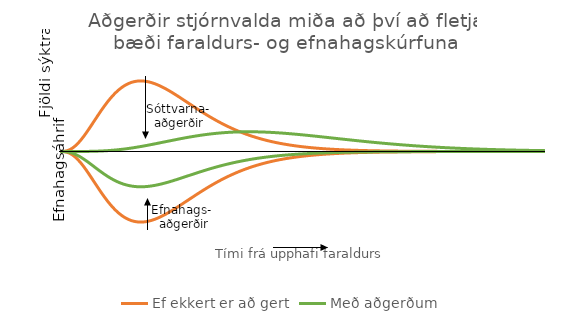
| Category | Ef ekkert er að gert | Með aðgerðum | Series 2 | Series 3 |
|---|---|---|---|---|
|  | 0 | 0 | 0 | 0 |
|  | 0 | 0 | 0 | 0 |
|  | 0 | 0 | 0 | 0 |
|  | 0 | 0 | 0 | 0 |
|  | 0 | 0 | 0 | 0 |
|  | 0.001 | 0 | -0.001 | 0 |
|  | 0.001 | 0 | -0.001 | 0 |
|  | 0.001 | 0 | -0.001 | -0.001 |
|  | 0.002 | 0 | -0.002 | -0.001 |
|  | 0.002 | 0 | -0.002 | -0.001 |
|  | 0.003 | 0 | -0.003 | -0.001 |
|  | 0.004 | 0 | -0.004 | -0.002 |
|  | 0.005 | 0 | -0.005 | -0.002 |
|  | 0.006 | 0 | -0.006 | -0.003 |
|  | 0.007 | 0 | -0.007 | -0.003 |
|  | 0.008 | 0 | -0.008 | -0.004 |
|  | 0.009 | 0 | -0.009 | -0.005 |
|  | 0.011 | 0 | -0.011 | -0.005 |
|  | 0.013 | 0 | -0.013 | -0.006 |
|  | 0.014 | 0 | -0.014 | -0.007 |
|  | 0.016 | 0 | -0.016 | -0.008 |
|  | 0.018 | 0 | -0.018 | -0.009 |
|  | 0.02 | 0 | -0.02 | -0.01 |
|  | 0.023 | 0 | -0.023 | -0.011 |
|  | 0.025 | 0 | -0.025 | -0.013 |
|  | 0.028 | 0 | -0.028 | -0.014 |
|  | 0.031 | 0 | -0.031 | -0.015 |
|  | 0.033 | 0 | -0.033 | -0.017 |
|  | 0.036 | 0 | -0.036 | -0.018 |
|  | 0.04 | 0 | -0.04 | -0.02 |
|  | 0.043 | 0 | -0.043 | -0.021 |
|  | 0.046 | 0 | -0.046 | -0.023 |
|  | 0.05 | 0 | -0.05 | -0.025 |
|  | 0.053 | 0 | -0.053 | -0.027 |
|  | 0.057 | 0 | -0.057 | -0.028 |
|  | 0.061 | 0 | -0.061 | -0.03 |
|  | 0.064 | 0 | -0.064 | -0.032 |
|  | 0.068 | 0 | -0.068 | -0.034 |
|  | 0.073 | 0 | -0.073 | -0.036 |
|  | 0.077 | 0 | -0.077 | -0.038 |
|  | 0.081 | 0 | -0.081 | -0.04 |
|  | 0.085 | 0 | -0.085 | -0.043 |
|  | 0.09 | 0 | -0.09 | -0.045 |
|  | 0.094 | 0 | -0.094 | -0.047 |
|  | 0.099 | 0 | -0.099 | -0.049 |
|  | 0.103 | 0 | -0.103 | -0.052 |
|  | 0.108 | 0 | -0.108 | -0.054 |
|  | 0.113 | 0 | -0.113 | -0.056 |
|  | 0.118 | 0 | -0.118 | -0.059 |
|  | 0.123 | 0.001 | -0.123 | -0.061 |
|  | 0.128 | 0.001 | -0.128 | -0.064 |
|  | 0.133 | 0.001 | -0.133 | -0.066 |
|  | 0.138 | 0.001 | -0.138 | -0.069 |
|  | 0.143 | 0.001 | -0.143 | -0.071 |
|  | 0.148 | 0.001 | -0.148 | -0.074 |
|  | 0.153 | 0.001 | -0.153 | -0.076 |
|  | 0.158 | 0.001 | -0.158 | -0.079 |
|  | 0.163 | 0.001 | -0.163 | -0.082 |
|  | 0.168 | 0.001 | -0.168 | -0.084 |
|  | 0.173 | 0.001 | -0.173 | -0.087 |
|  | 0.179 | 0.001 | -0.179 | -0.089 |
|  | 0.184 | 0.001 | -0.184 | -0.092 |
|  | 0.189 | 0.001 | -0.189 | -0.095 |
|  | 0.194 | 0.002 | -0.194 | -0.097 |
|  | 0.2 | 0.002 | -0.2 | -0.1 |
|  | 0.205 | 0.002 | -0.205 | -0.102 |
|  | 0.21 | 0.002 | -0.21 | -0.105 |
|  | 0.215 | 0.002 | -0.215 | -0.108 |
|  | 0.22 | 0.002 | -0.22 | -0.11 |
|  | 0.226 | 0.002 | -0.226 | -0.113 |
|  | 0.231 | 0.002 | -0.231 | -0.115 |
|  | 0.236 | 0.002 | -0.236 | -0.118 |
|  | 0.241 | 0.003 | -0.241 | -0.12 |
|  | 0.246 | 0.003 | -0.246 | -0.123 |
|  | 0.251 | 0.003 | -0.251 | -0.126 |
|  | 0.256 | 0.003 | -0.256 | -0.128 |
|  | 0.261 | 0.003 | -0.261 | -0.13 |
|  | 0.266 | 0.003 | -0.266 | -0.133 |
|  | 0.271 | 0.004 | -0.271 | -0.135 |
|  | 0.276 | 0.004 | -0.276 | -0.138 |
|  | 0.28 | 0.004 | -0.28 | -0.14 |
|  | 0.285 | 0.004 | -0.285 | -0.143 |
|  | 0.29 | 0.004 | -0.29 | -0.145 |
|  | 0.295 | 0.004 | -0.295 | -0.147 |
|  | 0.299 | 0.005 | -0.299 | -0.15 |
|  | 0.304 | 0.005 | -0.304 | -0.152 |
|  | 0.308 | 0.005 | -0.308 | -0.154 |
|  | 0.313 | 0.005 | -0.313 | -0.156 |
|  | 0.317 | 0.006 | -0.317 | -0.159 |
|  | 0.321 | 0.006 | -0.321 | -0.161 |
|  | 0.326 | 0.006 | -0.326 | -0.163 |
|  | 0.33 | 0.006 | -0.33 | -0.165 |
|  | 0.334 | 0.007 | -0.334 | -0.167 |
|  | 0.338 | 0.007 | -0.338 | -0.169 |
|  | 0.342 | 0.007 | -0.342 | -0.171 |
|  | 0.346 | 0.007 | -0.346 | -0.173 |
|  | 0.35 | 0.008 | -0.35 | -0.175 |
|  | 0.354 | 0.008 | -0.354 | -0.177 |
|  | 0.357 | 0.008 | -0.357 | -0.179 |
|  | 0.361 | 0.008 | -0.361 | -0.18 |
|  | 0.364 | 0.009 | -0.364 | -0.182 |
|  | 0.368 | 0.009 | -0.368 | -0.184 |
|  | 0.371 | 0.009 | -0.371 | -0.186 |
|  | 0.375 | 0.01 | -0.375 | -0.187 |
|  | 0.378 | 0.01 | -0.378 | -0.189 |
|  | 0.381 | 0.01 | -0.381 | -0.191 |
|  | 0.384 | 0.011 | -0.384 | -0.192 |
|  | 0.387 | 0.011 | -0.387 | -0.194 |
|  | 0.39 | 0.011 | -0.39 | -0.195 |
|  | 0.393 | 0.012 | -0.393 | -0.197 |
|  | 0.396 | 0.012 | -0.396 | -0.198 |
|  | 0.399 | 0.013 | -0.399 | -0.199 |
|  | 0.402 | 0.013 | -0.402 | -0.201 |
|  | 0.404 | 0.013 | -0.404 | -0.202 |
|  | 0.407 | 0.014 | -0.407 | -0.203 |
|  | 0.409 | 0.014 | -0.409 | -0.205 |
|  | 0.411 | 0.015 | -0.411 | -0.206 |
|  | 0.414 | 0.015 | -0.414 | -0.207 |
|  | 0.416 | 0.015 | -0.416 | -0.208 |
|  | 0.418 | 0.016 | -0.418 | -0.209 |
|  | 0.42 | 0.016 | -0.42 | -0.21 |
|  | 0.422 | 0.017 | -0.422 | -0.211 |
|  | 0.424 | 0.017 | -0.424 | -0.212 |
|  | 0.426 | 0.018 | -0.426 | -0.213 |
|  | 0.428 | 0.018 | -0.428 | -0.214 |
|  | 0.429 | 0.019 | -0.429 | -0.215 |
|  | 0.431 | 0.019 | -0.431 | -0.215 |
|  | 0.432 | 0.02 | -0.432 | -0.216 |
|  | 0.434 | 0.02 | -0.434 | -0.217 |
|  | 0.435 | 0.021 | -0.435 | -0.218 |
|  | 0.436 | 0.021 | -0.436 | -0.218 |
|  | 0.438 | 0.022 | -0.438 | -0.219 |
|  | 0.439 | 0.022 | -0.439 | -0.219 |
|  | 0.44 | 0.023 | -0.44 | -0.22 |
|  | 0.441 | 0.023 | -0.441 | -0.22 |
|  | 0.442 | 0.024 | -0.442 | -0.221 |
|  | 0.443 | 0.024 | -0.443 | -0.221 |
|  | 0.444 | 0.025 | -0.444 | -0.222 |
|  | 0.444 | 0.025 | -0.444 | -0.222 |
|  | 0.445 | 0.026 | -0.445 | -0.222 |
|  | 0.446 | 0.026 | -0.446 | -0.223 |
|  | 0.446 | 0.027 | -0.446 | -0.223 |
|  | 0.447 | 0.027 | -0.447 | -0.223 |
|  | 0.447 | 0.028 | -0.447 | -0.223 |
|  | 0.447 | 0.029 | -0.447 | -0.224 |
|  | 0.448 | 0.029 | -0.448 | -0.224 |
|  | 0.448 | 0.03 | -0.448 | -0.224 |
|  | 0.448 | 0.03 | -0.448 | -0.224 |
|  | 0.448 | 0.031 | -0.448 | -0.224 |
|  | 0.448 | 0.032 | -0.448 | -0.224 |
|  | 0.448 | 0.032 | -0.448 | -0.224 |
|  | 0.448 | 0.033 | -0.448 | -0.224 |
|  | 0.448 | 0.033 | -0.448 | -0.224 |
|  | 0.448 | 0.034 | -0.448 | -0.224 |
|  | 0.447 | 0.035 | -0.447 | -0.224 |
|  | 0.447 | 0.035 | -0.447 | -0.224 |
|  | 0.447 | 0.036 | -0.447 | -0.223 |
|  | 0.446 | 0.036 | -0.446 | -0.223 |
|  | 0.446 | 0.037 | -0.446 | -0.223 |
|  | 0.445 | 0.038 | -0.445 | -0.223 |
|  | 0.445 | 0.038 | -0.445 | -0.222 |
|  | 0.444 | 0.039 | -0.444 | -0.222 |
|  | 0.443 | 0.04 | -0.443 | -0.222 |
|  | 0.443 | 0.04 | -0.443 | -0.221 |
|  | 0.442 | 0.041 | -0.442 | -0.221 |
|  | 0.441 | 0.042 | -0.441 | -0.22 |
|  | 0.44 | 0.042 | -0.44 | -0.22 |
|  | 0.439 | 0.043 | -0.439 | -0.22 |
|  | 0.438 | 0.044 | -0.438 | -0.219 |
|  | 0.437 | 0.044 | -0.437 | -0.219 |
|  | 0.436 | 0.045 | -0.436 | -0.218 |
|  | 0.435 | 0.046 | -0.435 | -0.218 |
|  | 0.434 | 0.046 | -0.434 | -0.217 |
|  | 0.433 | 0.047 | -0.433 | -0.216 |
|  | 0.432 | 0.048 | -0.432 | -0.216 |
|  | 0.43 | 0.048 | -0.43 | -0.215 |
|  | 0.429 | 0.049 | -0.429 | -0.215 |
|  | 0.428 | 0.05 | -0.428 | -0.214 |
|  | 0.426 | 0.05 | -0.426 | -0.213 |
|  | 0.425 | 0.051 | -0.425 | -0.212 |
|  | 0.424 | 0.052 | -0.424 | -0.212 |
|  | 0.422 | 0.053 | -0.422 | -0.211 |
|  | 0.421 | 0.053 | -0.421 | -0.21 |
|  | 0.419 | 0.054 | -0.419 | -0.21 |
|  | 0.417 | 0.055 | -0.417 | -0.209 |
|  | 0.416 | 0.055 | -0.416 | -0.208 |
|  | 0.414 | 0.056 | -0.414 | -0.207 |
|  | 0.413 | 0.057 | -0.413 | -0.206 |
|  | 0.411 | 0.057 | -0.411 | -0.205 |
|  | 0.409 | 0.058 | -0.409 | -0.205 |
|  | 0.407 | 0.059 | -0.407 | -0.204 |
|  | 0.406 | 0.059 | -0.406 | -0.203 |
|  | 0.404 | 0.06 | -0.404 | -0.202 |
|  | 0.402 | 0.061 | -0.402 | -0.201 |
|  | 0.4 | 0.062 | -0.4 | -0.2 |
|  | 0.398 | 0.062 | -0.398 | -0.199 |
|  | 0.397 | 0.063 | -0.397 | -0.198 |
|  | 0.395 | 0.064 | -0.395 | -0.197 |
|  | 0.393 | 0.064 | -0.393 | -0.196 |
|  | 0.391 | 0.065 | -0.391 | -0.195 |
|  | 0.389 | 0.066 | -0.389 | -0.194 |
|  | 0.387 | 0.066 | -0.387 | -0.193 |
|  | 0.385 | 0.067 | -0.385 | -0.192 |
|  | 0.383 | 0.068 | -0.383 | -0.191 |
|  | 0.381 | 0.069 | -0.381 | -0.19 |
|  | 0.379 | 0.069 | -0.379 | -0.189 |
|  | 0.377 | 0.07 | -0.377 | -0.188 |
|  | 0.375 | 0.071 | -0.375 | -0.187 |
|  | 0.372 | 0.071 | -0.372 | -0.186 |
|  | 0.37 | 0.072 | -0.37 | -0.185 |
|  | 0.368 | 0.073 | -0.368 | -0.184 |
|  | 0.366 | 0.073 | -0.366 | -0.183 |
|  | 0.364 | 0.074 | -0.364 | -0.182 |
|  | 0.362 | 0.075 | -0.362 | -0.181 |
|  | 0.36 | 0.075 | -0.36 | -0.18 |
|  | 0.357 | 0.076 | -0.357 | -0.179 |
|  | 0.355 | 0.077 | -0.355 | -0.178 |
|  | 0.353 | 0.077 | -0.353 | -0.177 |
|  | 0.351 | 0.078 | -0.351 | -0.175 |
|  | 0.349 | 0.079 | -0.349 | -0.174 |
|  | 0.346 | 0.079 | -0.346 | -0.173 |
|  | 0.344 | 0.08 | -0.344 | -0.172 |
|  | 0.342 | 0.081 | -0.342 | -0.171 |
|  | 0.34 | 0.081 | -0.34 | -0.17 |
|  | 0.337 | 0.082 | -0.337 | -0.169 |
|  | 0.335 | 0.083 | -0.335 | -0.168 |
|  | 0.333 | 0.083 | -0.333 | -0.166 |
|  | 0.331 | 0.084 | -0.331 | -0.165 |
|  | 0.328 | 0.085 | -0.328 | -0.164 |
|  | 0.326 | 0.085 | -0.326 | -0.163 |
|  | 0.324 | 0.086 | -0.324 | -0.162 |
|  | 0.322 | 0.087 | -0.322 | -0.161 |
|  | 0.319 | 0.087 | -0.319 | -0.16 |
|  | 0.317 | 0.088 | -0.317 | -0.159 |
|  | 0.315 | 0.088 | -0.315 | -0.157 |
|  | 0.312 | 0.089 | -0.312 | -0.156 |
|  | 0.31 | 0.09 | -0.31 | -0.155 |
|  | 0.308 | 0.09 | -0.308 | -0.154 |
|  | 0.306 | 0.091 | -0.306 | -0.153 |
|  | 0.303 | 0.091 | -0.303 | -0.152 |
|  | 0.301 | 0.092 | -0.301 | -0.151 |
|  | 0.299 | 0.093 | -0.299 | -0.149 |
|  | 0.297 | 0.093 | -0.297 | -0.148 |
|  | 0.294 | 0.094 | -0.294 | -0.147 |
|  | 0.292 | 0.094 | -0.292 | -0.146 |
|  | 0.29 | 0.095 | -0.29 | -0.145 |
|  | 0.288 | 0.096 | -0.288 | -0.144 |
|  | 0.285 | 0.096 | -0.285 | -0.143 |
|  | 0.283 | 0.097 | -0.283 | -0.141 |
|  | 0.281 | 0.097 | -0.281 | -0.14 |
|  | 0.279 | 0.098 | -0.279 | -0.139 |
|  | 0.276 | 0.098 | -0.276 | -0.138 |
|  | 0.274 | 0.099 | -0.274 | -0.137 |
|  | 0.272 | 0.099 | -0.272 | -0.136 |
|  | 0.27 | 0.1 | -0.27 | -0.135 |
|  | 0.267 | 0.1 | -0.267 | -0.134 |
|  | 0.265 | 0.101 | -0.265 | -0.133 |
|  | 0.263 | 0.102 | -0.263 | -0.131 |
|  | 0.261 | 0.102 | -0.261 | -0.13 |
|  | 0.259 | 0.103 | -0.259 | -0.129 |
|  | 0.256 | 0.103 | -0.256 | -0.128 |
|  | 0.254 | 0.104 | -0.254 | -0.127 |
|  | 0.252 | 0.104 | -0.252 | -0.126 |
|  | 0.25 | 0.105 | -0.25 | -0.125 |
|  | 0.248 | 0.105 | -0.248 | -0.124 |
|  | 0.246 | 0.106 | -0.246 | -0.123 |
|  | 0.243 | 0.106 | -0.243 | -0.122 |
|  | 0.241 | 0.106 | -0.241 | -0.121 |
|  | 0.239 | 0.107 | -0.239 | -0.12 |
|  | 0.237 | 0.107 | -0.237 | -0.119 |
|  | 0.235 | 0.108 | -0.235 | -0.117 |
|  | 0.233 | 0.108 | -0.233 | -0.116 |
|  | 0.231 | 0.109 | -0.231 | -0.115 |
|  | 0.229 | 0.109 | -0.229 | -0.114 |
|  | 0.227 | 0.11 | -0.227 | -0.113 |
|  | 0.225 | 0.11 | -0.225 | -0.112 |
|  | 0.223 | 0.11 | -0.223 | -0.111 |
|  | 0.221 | 0.111 | -0.221 | -0.11 |
|  | 0.218 | 0.111 | -0.218 | -0.109 |
|  | 0.216 | 0.112 | -0.216 | -0.108 |
|  | 0.214 | 0.112 | -0.214 | -0.107 |
|  | 0.212 | 0.112 | -0.212 | -0.106 |
|  | 0.21 | 0.113 | -0.21 | -0.105 |
|  | 0.209 | 0.113 | -0.209 | -0.104 |
|  | 0.207 | 0.114 | -0.207 | -0.103 |
|  | 0.205 | 0.114 | -0.205 | -0.102 |
|  | 0.203 | 0.114 | -0.203 | -0.101 |
|  | 0.201 | 0.115 | -0.201 | -0.1 |
|  | 0.199 | 0.115 | -0.199 | -0.099 |
|  | 0.197 | 0.115 | -0.197 | -0.098 |
|  | 0.195 | 0.116 | -0.195 | -0.098 |
|  | 0.193 | 0.116 | -0.193 | -0.097 |
|  | 0.191 | 0.116 | -0.191 | -0.096 |
|  | 0.189 | 0.117 | -0.189 | -0.095 |
|  | 0.188 | 0.117 | -0.188 | -0.094 |
|  | 0.186 | 0.117 | -0.186 | -0.093 |
|  | 0.184 | 0.118 | -0.184 | -0.092 |
|  | 0.182 | 0.118 | -0.182 | -0.091 |
|  | 0.18 | 0.118 | -0.18 | -0.09 |
|  | 0.178 | 0.118 | -0.178 | -0.089 |
|  | 0.177 | 0.119 | -0.177 | -0.088 |
|  | 0.175 | 0.119 | -0.175 | -0.087 |
|  | 0.173 | 0.119 | -0.173 | -0.087 |
|  | 0.171 | 0.12 | -0.171 | -0.086 |
|  | 0.17 | 0.12 | -0.17 | -0.085 |
|  | 0.168 | 0.12 | -0.168 | -0.084 |
|  | 0.166 | 0.12 | -0.166 | -0.083 |
|  | 0.165 | 0.121 | -0.165 | -0.082 |
|  | 0.163 | 0.121 | -0.163 | -0.081 |
|  | 0.161 | 0.121 | -0.161 | -0.081 |
|  | 0.16 | 0.121 | -0.16 | -0.08 |
|  | 0.158 | 0.121 | -0.158 | -0.079 |
|  | 0.156 | 0.122 | -0.156 | -0.078 |
|  | 0.155 | 0.122 | -0.155 | -0.077 |
|  | 0.153 | 0.122 | -0.153 | -0.077 |
|  | 0.151 | 0.122 | -0.151 | -0.076 |
|  | 0.15 | 0.122 | -0.15 | -0.075 |
|  | 0.148 | 0.123 | -0.148 | -0.074 |
|  | 0.147 | 0.123 | -0.147 | -0.073 |
|  | 0.145 | 0.123 | -0.145 | -0.073 |
|  | 0.144 | 0.123 | -0.144 | -0.072 |
|  | 0.142 | 0.123 | -0.142 | -0.071 |
|  | 0.141 | 0.123 | -0.141 | -0.07 |
|  | 0.139 | 0.124 | -0.139 | -0.07 |
|  | 0.138 | 0.124 | -0.138 | -0.069 |
|  | 0.136 | 0.124 | -0.136 | -0.068 |
|  | 0.135 | 0.124 | -0.135 | -0.067 |
|  | 0.133 | 0.124 | -0.133 | -0.067 |
|  | 0.132 | 0.124 | -0.132 | -0.066 |
|  | 0.13 | 0.124 | -0.13 | -0.065 |
|  | 0.129 | 0.124 | -0.129 | -0.064 |
|  | 0.128 | 0.124 | -0.128 | -0.064 |
|  | 0.126 | 0.125 | -0.126 | -0.063 |
|  | 0.125 | 0.125 | -0.125 | -0.062 |
|  | 0.123 | 0.125 | -0.123 | -0.062 |
|  | 0.122 | 0.125 | -0.122 | -0.061 |
|  | 0.121 | 0.125 | -0.121 | -0.06 |
|  | 0.119 | 0.125 | -0.119 | -0.06 |
|  | 0.118 | 0.125 | -0.118 | -0.059 |
|  | 0.117 | 0.125 | -0.117 | -0.058 |
|  | 0.115 | 0.125 | -0.115 | -0.058 |
|  | 0.114 | 0.125 | -0.114 | -0.057 |
|  | 0.113 | 0.125 | -0.113 | -0.056 |
|  | 0.112 | 0.125 | -0.112 | -0.056 |
|  | 0.11 | 0.125 | -0.11 | -0.055 |
|  | 0.109 | 0.125 | -0.109 | -0.055 |
|  | 0.108 | 0.125 | -0.108 | -0.054 |
|  | 0.107 | 0.125 | -0.107 | -0.053 |
|  | 0.105 | 0.125 | -0.105 | -0.053 |
|  | 0.104 | 0.125 | -0.104 | -0.052 |
|  | 0.103 | 0.125 | -0.103 | -0.052 |
|  | 0.102 | 0.125 | -0.102 | -0.051 |
|  | 0.101 | 0.125 | -0.101 | -0.05 |
|  | 0.1 | 0.125 | -0.1 | -0.05 |
|  | 0.098 | 0.125 | -0.098 | -0.049 |
|  | 0.097 | 0.125 | -0.097 | -0.049 |
|  | 0.096 | 0.125 | -0.096 | -0.048 |
|  | 0.095 | 0.125 | -0.095 | -0.048 |
|  | 0.094 | 0.125 | -0.094 | -0.047 |
|  | 0.093 | 0.125 | -0.093 | -0.046 |
|  | 0.092 | 0.125 | -0.092 | -0.046 |
|  | 0.091 | 0.125 | -0.091 | -0.045 |
|  | 0.09 | 0.125 | -0.09 | -0.045 |
|  | 0.089 | 0.125 | -0.089 | -0.044 |
|  | 0.088 | 0.125 | -0.088 | -0.044 |
|  | 0.087 | 0.125 | -0.087 | -0.043 |
|  | 0.086 | 0.125 | -0.086 | -0.043 |
|  | 0.085 | 0.125 | -0.085 | -0.042 |
|  | 0.084 | 0.124 | -0.084 | -0.042 |
|  | 0.083 | 0.124 | -0.083 | -0.041 |
|  | 0.082 | 0.124 | -0.082 | -0.041 |
|  | 0.081 | 0.124 | -0.081 | -0.04 |
|  | 0.08 | 0.124 | -0.08 | -0.04 |
|  | 0.079 | 0.124 | -0.079 | -0.039 |
|  | 0.078 | 0.124 | -0.078 | -0.039 |
|  | 0.077 | 0.124 | -0.077 | -0.038 |
|  | 0.076 | 0.124 | -0.076 | -0.038 |
|  | 0.075 | 0.123 | -0.075 | -0.038 |
|  | 0.074 | 0.123 | -0.074 | -0.037 |
|  | 0.073 | 0.123 | -0.073 | -0.037 |
|  | 0.072 | 0.123 | -0.072 | -0.036 |
|  | 0.071 | 0.123 | -0.071 | -0.036 |
|  | 0.071 | 0.123 | -0.071 | -0.035 |
|  | 0.07 | 0.123 | -0.07 | -0.035 |
|  | 0.069 | 0.122 | -0.069 | -0.034 |
|  | 0.068 | 0.122 | -0.068 | -0.034 |
|  | 0.067 | 0.122 | -0.067 | -0.034 |
|  | 0.066 | 0.122 | -0.066 | -0.033 |
|  | 0.066 | 0.122 | -0.066 | -0.033 |
|  | 0.065 | 0.122 | -0.065 | -0.032 |
|  | 0.064 | 0.121 | -0.064 | -0.032 |
|  | 0.063 | 0.121 | -0.063 | -0.032 |
|  | 0.062 | 0.121 | -0.062 | -0.031 |
|  | 0.062 | 0.121 | -0.062 | -0.031 |
|  | 0.061 | 0.121 | -0.061 | -0.03 |
|  | 0.06 | 0.12 | -0.06 | -0.03 |
|  | 0.059 | 0.12 | -0.059 | -0.03 |
|  | 0.059 | 0.12 | -0.059 | -0.029 |
|  | 0.058 | 0.12 | -0.058 | -0.029 |
|  | 0.057 | 0.12 | -0.057 | -0.029 |
|  | 0.057 | 0.119 | -0.057 | -0.028 |
|  | 0.056 | 0.119 | -0.056 | -0.028 |
|  | 0.055 | 0.119 | -0.055 | -0.028 |
|  | 0.054 | 0.119 | -0.054 | -0.027 |
|  | 0.054 | 0.119 | -0.054 | -0.027 |
|  | 0.053 | 0.118 | -0.053 | -0.027 |
|  | 0.052 | 0.118 | -0.052 | -0.026 |
|  | 0.052 | 0.118 | -0.052 | -0.026 |
|  | 0.051 | 0.118 | -0.051 | -0.026 |
|  | 0.05 | 0.117 | -0.05 | -0.025 |
|  | 0.05 | 0.117 | -0.05 | -0.025 |
|  | 0.049 | 0.117 | -0.049 | -0.025 |
|  | 0.049 | 0.117 | -0.049 | -0.024 |
|  | 0.048 | 0.116 | -0.048 | -0.024 |
|  | 0.047 | 0.116 | -0.047 | -0.024 |
|  | 0.047 | 0.116 | -0.047 | -0.023 |
|  | 0.046 | 0.116 | -0.046 | -0.023 |
|  | 0.046 | 0.115 | -0.046 | -0.023 |
|  | 0.045 | 0.115 | -0.045 | -0.023 |
|  | 0.044 | 0.115 | -0.044 | -0.022 |
|  | 0.044 | 0.114 | -0.044 | -0.022 |
|  | 0.043 | 0.114 | -0.043 | -0.022 |
|  | 0.043 | 0.114 | -0.043 | -0.021 |
|  | 0.042 | 0.114 | -0.042 | -0.021 |
|  | 0.042 | 0.113 | -0.042 | -0.021 |
|  | 0.041 | 0.113 | -0.041 | -0.021 |
|  | 0.041 | 0.113 | -0.041 | -0.02 |
|  | 0.04 | 0.112 | -0.04 | -0.02 |
|  | 0.04 | 0.112 | -0.04 | -0.02 |
|  | 0.039 | 0.112 | -0.039 | -0.02 |
|  | 0.039 | 0.112 | -0.039 | -0.019 |
|  | 0.038 | 0.111 | -0.038 | -0.019 |
|  | 0.038 | 0.111 | -0.038 | -0.019 |
|  | 0.037 | 0.111 | -0.037 | -0.019 |
|  | 0.037 | 0.11 | -0.037 | -0.018 |
|  | 0.036 | 0.11 | -0.036 | -0.018 |
|  | 0.036 | 0.11 | -0.036 | -0.018 |
|  | 0.035 | 0.109 | -0.035 | -0.018 |
|  | 0.035 | 0.109 | -0.035 | -0.017 |
|  | 0.034 | 0.109 | -0.034 | -0.017 |
|  | 0.034 | 0.108 | -0.034 | -0.017 |
|  | 0.033 | 0.108 | -0.033 | -0.017 |
|  | 0.033 | 0.108 | -0.033 | -0.016 |
|  | 0.032 | 0.108 | -0.032 | -0.016 |
|  | 0.032 | 0.107 | -0.032 | -0.016 |
|  | 0.032 | 0.107 | -0.032 | -0.016 |
|  | 0.031 | 0.107 | -0.031 | -0.016 |
|  | 0.031 | 0.106 | -0.031 | -0.015 |
|  | 0.03 | 0.106 | -0.03 | -0.015 |
|  | 0.03 | 0.106 | -0.03 | -0.015 |
|  | 0.03 | 0.105 | -0.03 | -0.015 |
|  | 0.029 | 0.105 | -0.029 | -0.015 |
|  | 0.029 | 0.105 | -0.029 | -0.014 |
|  | 0.028 | 0.104 | -0.028 | -0.014 |
|  | 0.028 | 0.104 | -0.028 | -0.014 |
|  | 0.028 | 0.103 | -0.028 | -0.014 |
|  | 0.027 | 0.103 | -0.027 | -0.014 |
|  | 0.027 | 0.103 | -0.027 | -0.013 |
|  | 0.027 | 0.102 | -0.027 | -0.013 |
|  | 0.026 | 0.102 | -0.026 | -0.013 |
|  | 0.026 | 0.102 | -0.026 | -0.013 |
|  | 0.026 | 0.101 | -0.026 | -0.013 |
|  | 0.025 | 0.101 | -0.025 | -0.013 |
|  | 0.025 | 0.101 | -0.025 | -0.012 |
|  | 0.025 | 0.1 | -0.025 | -0.012 |
|  | 0.024 | 0.1 | -0.024 | -0.012 |
|  | 0.024 | 0.1 | -0.024 | -0.012 |
|  | 0.024 | 0.099 | -0.024 | -0.012 |
|  | 0.023 | 0.099 | -0.023 | -0.012 |
|  | 0.023 | 0.099 | -0.023 | -0.011 |
|  | 0.023 | 0.098 | -0.023 | -0.011 |
|  | 0.022 | 0.098 | -0.022 | -0.011 |
|  | 0.022 | 0.097 | -0.022 | -0.011 |
|  | 0.022 | 0.097 | -0.022 | -0.011 |
|  | 0.021 | 0.097 | -0.021 | -0.011 |
|  | 0.021 | 0.096 | -0.021 | -0.011 |
|  | 0.021 | 0.096 | -0.021 | -0.01 |
|  | 0.021 | 0.096 | -0.021 | -0.01 |
|  | 0.02 | 0.095 | -0.02 | -0.01 |
|  | 0.02 | 0.095 | -0.02 | -0.01 |
|  | 0.02 | 0.095 | -0.02 | -0.01 |
|  | 0.019 | 0.094 | -0.019 | -0.01 |
|  | 0.019 | 0.094 | -0.019 | -0.01 |
|  | 0.019 | 0.093 | -0.019 | -0.009 |
|  | 0.019 | 0.093 | -0.019 | -0.009 |
|  | 0.018 | 0.093 | -0.018 | -0.009 |
|  | 0.018 | 0.092 | -0.018 | -0.009 |
|  | 0.018 | 0.092 | -0.018 | -0.009 |
|  | 0.018 | 0.092 | -0.018 | -0.009 |
|  | 0.017 | 0.091 | -0.017 | -0.009 |
|  | 0.017 | 0.091 | -0.017 | -0.009 |
|  | 0.017 | 0.09 | -0.017 | -0.008 |
|  | 0.017 | 0.09 | -0.017 | -0.008 |
|  | 0.016 | 0.09 | -0.016 | -0.008 |
|  | 0.016 | 0.089 | -0.016 | -0.008 |
|  | 0.016 | 0.089 | -0.016 | -0.008 |
|  | 0.016 | 0.089 | -0.016 | -0.008 |
|  | 0.016 | 0.088 | -0.016 | -0.008 |
|  | 0.015 | 0.088 | -0.015 | -0.008 |
|  | 0.015 | 0.087 | -0.015 | -0.008 |
|  | 0.015 | 0.087 | -0.015 | -0.007 |
|  | 0.015 | 0.087 | -0.015 | -0.007 |
|  | 0.015 | 0.086 | -0.015 | -0.007 |
|  | 0.014 | 0.086 | -0.014 | -0.007 |
|  | 0.014 | 0.086 | -0.014 | -0.007 |
|  | 0.014 | 0.085 | -0.014 | -0.007 |
|  | 0.014 | 0.085 | -0.014 | -0.007 |
|  | 0.014 | 0.084 | -0.014 | -0.007 |
|  | 0.013 | 0.084 | -0.013 | -0.007 |
|  | 0.013 | 0.084 | -0.013 | -0.007 |
|  | 0.013 | 0.083 | -0.013 | -0.006 |
|  | 0.013 | 0.083 | -0.013 | -0.006 |
|  | 0.013 | 0.083 | -0.013 | -0.006 |
|  | 0.012 | 0.082 | -0.012 | -0.006 |
|  | 0.012 | 0.082 | -0.012 | -0.006 |
|  | 0.012 | 0.081 | -0.012 | -0.006 |
|  | 0.012 | 0.081 | -0.012 | -0.006 |
|  | 0.012 | 0.081 | -0.012 | -0.006 |
|  | 0.012 | 0.08 | -0.012 | -0.006 |
|  | 0.011 | 0.08 | -0.011 | -0.006 |
|  | 0.011 | 0.08 | -0.011 | -0.006 |
|  | 0.011 | 0.079 | -0.011 | -0.006 |
|  | 0.011 | 0.079 | -0.011 | -0.005 |
|  | 0.011 | 0.078 | -0.011 | -0.005 |
|  | 0.011 | 0.078 | -0.011 | -0.005 |
|  | 0.01 | 0.078 | -0.01 | -0.005 |
|  | 0.01 | 0.077 | -0.01 | -0.005 |
|  | 0.01 | 0.077 | -0.01 | -0.005 |
|  | 0.01 | 0.077 | -0.01 | -0.005 |
|  | 0.01 | 0.076 | -0.01 | -0.005 |
|  | 0.01 | 0.076 | -0.01 | -0.005 |
|  | 0.01 | 0.076 | -0.01 | -0.005 |
|  | 0.009 | 0.075 | -0.009 | -0.005 |
|  | 0.009 | 0.075 | -0.009 | -0.005 |
|  | 0.009 | 0.074 | -0.009 | -0.005 |
|  | 0.009 | 0.074 | -0.009 | -0.005 |
|  | 0.009 | 0.074 | -0.009 | -0.004 |
|  | 0.009 | 0.073 | -0.009 | -0.004 |
|  | 0.009 | 0.073 | -0.009 | -0.004 |
|  | 0.009 | 0.073 | -0.009 | -0.004 |
|  | 0.008 | 0.072 | -0.008 | -0.004 |
|  | 0.008 | 0.072 | -0.008 | -0.004 |
|  | 0.008 | 0.072 | -0.008 | -0.004 |
|  | 0.008 | 0.071 | -0.008 | -0.004 |
|  | 0.008 | 0.071 | -0.008 | -0.004 |
|  | 0.008 | 0.07 | -0.008 | -0.004 |
|  | 0.008 | 0.07 | -0.008 | -0.004 |
|  | 0.008 | 0.07 | -0.008 | -0.004 |
|  | 0.008 | 0.069 | -0.008 | -0.004 |
|  | 0.007 | 0.069 | -0.007 | -0.004 |
|  | 0.007 | 0.069 | -0.007 | -0.004 |
|  | 0.007 | 0.068 | -0.007 | -0.004 |
|  | 0.007 | 0.068 | -0.007 | -0.004 |
|  | 0.007 | 0.068 | -0.007 | -0.003 |
|  | 0.007 | 0.067 | -0.007 | -0.003 |
|  | 0.007 | 0.067 | -0.007 | -0.003 |
|  | 0.007 | 0.066 | -0.007 | -0.003 |
|  | 0.007 | 0.066 | -0.007 | -0.003 |
|  | 0.006 | 0.066 | -0.006 | -0.003 |
|  | 0.006 | 0.065 | -0.006 | -0.003 |
|  | 0.006 | 0.065 | -0.006 | -0.003 |
|  | 0.006 | 0.065 | -0.006 | -0.003 |
|  | 0.006 | 0.064 | -0.006 | -0.003 |
|  | 0.006 | 0.064 | -0.006 | -0.003 |
|  | 0.006 | 0.064 | -0.006 | -0.003 |
|  | 0.006 | 0.063 | -0.006 | -0.003 |
|  | 0.006 | 0.063 | -0.006 | -0.003 |
|  | 0.006 | 0.063 | -0.006 | -0.003 |
|  | 0.006 | 0.062 | -0.006 | -0.003 |
|  | 0.006 | 0.062 | -0.006 | -0.003 |
|  | 0.005 | 0.062 | -0.005 | -0.003 |
|  | 0.005 | 0.061 | -0.005 | -0.003 |
|  | 0.005 | 0.061 | -0.005 | -0.003 |
|  | 0.005 | 0.061 | -0.005 | -0.003 |
|  | 0.005 | 0.06 | -0.005 | -0.003 |
|  | 0.005 | 0.06 | -0.005 | -0.003 |
|  | 0.005 | 0.06 | -0.005 | -0.002 |
|  | 0.005 | 0.059 | -0.005 | -0.002 |
|  | 0.005 | 0.059 | -0.005 | -0.002 |
|  | 0.005 | 0.059 | -0.005 | -0.002 |
|  | 0.005 | 0.058 | -0.005 | -0.002 |
|  | 0.005 | 0.058 | -0.005 | -0.002 |
|  | 0.005 | 0.058 | -0.005 | -0.002 |
|  | 0.004 | 0.057 | -0.004 | -0.002 |
|  | 0.004 | 0.057 | -0.004 | -0.002 |
|  | 0.004 | 0.057 | -0.004 | -0.002 |
|  | 0.004 | 0.056 | -0.004 | -0.002 |
|  | 0.004 | 0.056 | -0.004 | -0.002 |
|  | 0.004 | 0.056 | -0.004 | -0.002 |
|  | 0.004 | 0.055 | -0.004 | -0.002 |
|  | 0.004 | 0.055 | -0.004 | -0.002 |
|  | 0.004 | 0.055 | -0.004 | -0.002 |
|  | 0.004 | 0.054 | -0.004 | -0.002 |
|  | 0.004 | 0.054 | -0.004 | -0.002 |
|  | 0.004 | 0.054 | -0.004 | -0.002 |
|  | 0.004 | 0.053 | -0.004 | -0.002 |
|  | 0.004 | 0.053 | -0.004 | -0.002 |
|  | 0.004 | 0.053 | -0.004 | -0.002 |
|  | 0.004 | 0.052 | -0.004 | -0.002 |
|  | 0.004 | 0.052 | -0.004 | -0.002 |
|  | 0.003 | 0.052 | -0.003 | -0.002 |
|  | 0.003 | 0.052 | -0.003 | -0.002 |
|  | 0.003 | 0.051 | -0.003 | -0.002 |
|  | 0.003 | 0.051 | -0.003 | -0.002 |
|  | 0.003 | 0.051 | -0.003 | -0.002 |
|  | 0.003 | 0.05 | -0.003 | -0.002 |
|  | 0.003 | 0.05 | -0.003 | -0.002 |
|  | 0.003 | 0.05 | -0.003 | -0.002 |
|  | 0.003 | 0.049 | -0.003 | -0.002 |
|  | 0.003 | 0.049 | -0.003 | -0.002 |
|  | 0.003 | 0.049 | -0.003 | -0.001 |
|  | 0.003 | 0.049 | -0.003 | -0.001 |
|  | 0.003 | 0.048 | -0.003 | -0.001 |
|  | 0.003 | 0.048 | -0.003 | -0.001 |
|  | 0.003 | 0.048 | -0.003 | -0.001 |
|  | 0.003 | 0.047 | -0.003 | -0.001 |
|  | 0.003 | 0.047 | -0.003 | -0.001 |
|  | 0.003 | 0.047 | -0.003 | -0.001 |
|  | 0.003 | 0.046 | -0.003 | -0.001 |
|  | 0.003 | 0.046 | -0.003 | -0.001 |
|  | 0.003 | 0.046 | -0.003 | -0.001 |
|  | 0.003 | 0.046 | -0.003 | -0.001 |
|  | 0.003 | 0.045 | -0.003 | -0.001 |
|  | 0.002 | 0.045 | -0.002 | -0.001 |
|  | 0.002 | 0.045 | -0.002 | -0.001 |
|  | 0.002 | 0.044 | -0.002 | -0.001 |
|  | 0.002 | 0.044 | -0.002 | -0.001 |
|  | 0.002 | 0.044 | -0.002 | -0.001 |
|  | 0.002 | 0.044 | -0.002 | -0.001 |
|  | 0.002 | 0.043 | -0.002 | -0.001 |
|  | 0.002 | 0.043 | -0.002 | -0.001 |
|  | 0.002 | 0.043 | -0.002 | -0.001 |
|  | 0.002 | 0.043 | -0.002 | -0.001 |
|  | 0.002 | 0.042 | -0.002 | -0.001 |
|  | 0.002 | 0.042 | -0.002 | -0.001 |
|  | 0.002 | 0.042 | -0.002 | -0.001 |
|  | 0.002 | 0.041 | -0.002 | -0.001 |
|  | 0.002 | 0.041 | -0.002 | -0.001 |
|  | 0.002 | 0.041 | -0.002 | -0.001 |
|  | 0.002 | 0.041 | -0.002 | -0.001 |
|  | 0.002 | 0.04 | -0.002 | -0.001 |
|  | 0.002 | 0.04 | -0.002 | -0.001 |
|  | 0.002 | 0.04 | -0.002 | -0.001 |
|  | 0.002 | 0.04 | -0.002 | -0.001 |
|  | 0.002 | 0.039 | -0.002 | -0.001 |
|  | 0.002 | 0.039 | -0.002 | -0.001 |
|  | 0.002 | 0.039 | -0.002 | -0.001 |
|  | 0.002 | 0.039 | -0.002 | -0.001 |
|  | 0.002 | 0.038 | -0.002 | -0.001 |
|  | 0.002 | 0.038 | -0.002 | -0.001 |
|  | 0.002 | 0.038 | -0.002 | -0.001 |
|  | 0.002 | 0.038 | -0.002 | -0.001 |
|  | 0.002 | 0.037 | -0.002 | -0.001 |
|  | 0.002 | 0.037 | -0.002 | -0.001 |
|  | 0.002 | 0.037 | -0.002 | -0.001 |
|  | 0.002 | 0.037 | -0.002 | -0.001 |
|  | 0.001 | 0.036 | -0.001 | -0.001 |
|  | 0.001 | 0.036 | -0.001 | -0.001 |
|  | 0.001 | 0.036 | -0.001 | -0.001 |
|  | 0.001 | 0.036 | -0.001 | -0.001 |
|  | 0.001 | 0.035 | -0.001 | -0.001 |
|  | 0.001 | 0.035 | -0.001 | -0.001 |
|  | 0.001 | 0.035 | -0.001 | -0.001 |
|  | 0.001 | 0.035 | -0.001 | -0.001 |
|  | 0.001 | 0.034 | -0.001 | -0.001 |
|  | 0.001 | 0.034 | -0.001 | -0.001 |
|  | 0.001 | 0.034 | -0.001 | -0.001 |
|  | 0.001 | 0.034 | -0.001 | -0.001 |
|  | 0.001 | 0.034 | -0.001 | -0.001 |
|  | 0.001 | 0.033 | -0.001 | -0.001 |
|  | 0.001 | 0.033 | -0.001 | -0.001 |
|  | 0.001 | 0.033 | -0.001 | -0.001 |
|  | 0.001 | 0.033 | -0.001 | -0.001 |
|  | 0.001 | 0.032 | -0.001 | -0.001 |
|  | 0.001 | 0.032 | -0.001 | -0.001 |
|  | 0.001 | 0.032 | -0.001 | -0.001 |
|  | 0.001 | 0.032 | -0.001 | -0.001 |
|  | 0.001 | 0.032 | -0.001 | -0.001 |
|  | 0.001 | 0.031 | -0.001 | -0.001 |
|  | 0.001 | 0.031 | -0.001 | -0.001 |
|  | 0.001 | 0.031 | -0.001 | -0.001 |
|  | 0.001 | 0.031 | -0.001 | -0.001 |
|  | 0.001 | 0.03 | -0.001 | 0 |
|  | 0.001 | 0.03 | -0.001 | 0 |
|  | 0.001 | 0.03 | -0.001 | 0 |
|  | 0.001 | 0.03 | -0.001 | 0 |
|  | 0.001 | 0.03 | -0.001 | 0 |
|  | 0.001 | 0.029 | -0.001 | 0 |
|  | 0.001 | 0.029 | -0.001 | 0 |
|  | 0.001 | 0.029 | -0.001 | 0 |
|  | 0.001 | 0.029 | -0.001 | 0 |
|  | 0.001 | 0.029 | -0.001 | 0 |
|  | 0.001 | 0.028 | -0.001 | 0 |
|  | 0.001 | 0.028 | -0.001 | 0 |
|  | 0.001 | 0.028 | -0.001 | 0 |
|  | 0.001 | 0.028 | -0.001 | 0 |
|  | 0.001 | 0.028 | -0.001 | 0 |
|  | 0.001 | 0.027 | -0.001 | 0 |
|  | 0.001 | 0.027 | -0.001 | 0 |
|  | 0.001 | 0.027 | -0.001 | 0 |
|  | 0.001 | 0.027 | -0.001 | 0 |
|  | 0.001 | 0.027 | -0.001 | 0 |
|  | 0.001 | 0.026 | -0.001 | 0 |
|  | 0.001 | 0.026 | -0.001 | 0 |
|  | 0.001 | 0.026 | -0.001 | 0 |
|  | 0.001 | 0.026 | -0.001 | 0 |
|  | 0.001 | 0.026 | -0.001 | 0 |
|  | 0.001 | 0.026 | -0.001 | 0 |
|  | 0.001 | 0.025 | -0.001 | 0 |
|  | 0.001 | 0.025 | -0.001 | 0 |
|  | 0.001 | 0.025 | -0.001 | 0 |
|  | 0.001 | 0.025 | -0.001 | 0 |
|  | 0.001 | 0.025 | -0.001 | 0 |
|  | 0.001 | 0.024 | -0.001 | 0 |
|  | 0.001 | 0.024 | -0.001 | 0 |
|  | 0.001 | 0.024 | -0.001 | 0 |
|  | 0.001 | 0.024 | -0.001 | 0 |
|  | 0.001 | 0.024 | -0.001 | 0 |
|  | 0.001 | 0.024 | -0.001 | 0 |
|  | 0.001 | 0.023 | -0.001 | 0 |
|  | 0.001 | 0.023 | -0.001 | 0 |
|  | 0.001 | 0.023 | -0.001 | 0 |
|  | 0.001 | 0.023 | -0.001 | 0 |
|  | 0.001 | 0.023 | -0.001 | 0 |
|  | 0.001 | 0.023 | -0.001 | 0 |
|  | 0.001 | 0.022 | -0.001 | 0 |
|  | 0 | 0.022 | 0 | 0 |
|  | 0 | 0.022 | 0 | 0 |
|  | 0 | 0.022 | 0 | 0 |
|  | 0 | 0.022 | 0 | 0 |
|  | 0 | 0.022 | 0 | 0 |
|  | 0 | 0.021 | 0 | 0 |
|  | 0 | 0.021 | 0 | 0 |
|  | 0 | 0.021 | 0 | 0 |
|  | 0 | 0.021 | 0 | 0 |
|  | 0 | 0.021 | 0 | 0 |
|  | 0 | 0.021 | 0 | 0 |
|  | 0 | 0.02 | 0 | 0 |
|  | 0 | 0.02 | 0 | 0 |
|  | 0 | 0.02 | 0 | 0 |
|  | 0 | 0.02 | 0 | 0 |
|  | 0 | 0.02 | 0 | 0 |
|  | 0 | 0.02 | 0 | 0 |
|  | 0 | 0.02 | 0 | 0 |
|  | 0 | 0.019 | 0 | 0 |
|  | 0 | 0.019 | 0 | 0 |
|  | 0 | 0.019 | 0 | 0 |
|  | 0 | 0.019 | 0 | 0 |
|  | 0 | 0.019 | 0 | 0 |
|  | 0 | 0.019 | 0 | 0 |
|  | 0 | 0.019 | 0 | 0 |
|  | 0 | 0.018 | 0 | 0 |
|  | 0 | 0.018 | 0 | 0 |
|  | 0 | 0.018 | 0 | 0 |
|  | 0 | 0.018 | 0 | 0 |
|  | 0 | 0.018 | 0 | 0 |
|  | 0 | 0.018 | 0 | 0 |
|  | 0 | 0.018 | 0 | 0 |
|  | 0 | 0.017 | 0 | 0 |
|  | 0 | 0.017 | 0 | 0 |
|  | 0 | 0.017 | 0 | 0 |
|  | 0 | 0.017 | 0 | 0 |
|  | 0 | 0.017 | 0 | 0 |
|  | 0 | 0.017 | 0 | 0 |
|  | 0 | 0.017 | 0 | 0 |
|  | 0 | 0.017 | 0 | 0 |
|  | 0 | 0.016 | 0 | 0 |
|  | 0 | 0.016 | 0 | 0 |
|  | 0 | 0.016 | 0 | 0 |
|  | 0 | 0.016 | 0 | 0 |
|  | 0 | 0.016 | 0 | 0 |
|  | 0 | 0.016 | 0 | 0 |
|  | 0 | 0.016 | 0 | 0 |
|  | 0 | 0.016 | 0 | 0 |
|  | 0 | 0.015 | 0 | 0 |
|  | 0 | 0.015 | 0 | 0 |
|  | 0 | 0.015 | 0 | 0 |
|  | 0 | 0.015 | 0 | 0 |
|  | 0 | 0.015 | 0 | 0 |
|  | 0 | 0.015 | 0 | 0 |
|  | 0 | 0.015 | 0 | 0 |
|  | 0 | 0.015 | 0 | 0 |
|  | 0 | 0.014 | 0 | 0 |
|  | 0 | 0.014 | 0 | 0 |
|  | 0 | 0.014 | 0 | 0 |
|  | 0 | 0.014 | 0 | 0 |
|  | 0 | 0.014 | 0 | 0 |
|  | 0 | 0.014 | 0 | 0 |
|  | 0 | 0.014 | 0 | 0 |
|  | 0 | 0.014 | 0 | 0 |
|  | 0 | 0.014 | 0 | 0 |
|  | 0 | 0.013 | 0 | 0 |
|  | 0 | 0.013 | 0 | 0 |
|  | 0 | 0.013 | 0 | 0 |
|  | 0 | 0.013 | 0 | 0 |
|  | 0 | 0.013 | 0 | 0 |
|  | 0 | 0.013 | 0 | 0 |
|  | 0 | 0.013 | 0 | 0 |
|  | 0 | 0.013 | 0 | 0 |
|  | 0 | 0.013 | 0 | 0 |
|  | 0 | 0.013 | 0 | 0 |
|  | 0 | 0.012 | 0 | 0 |
|  | 0 | 0.012 | 0 | 0 |
|  | 0 | 0.012 | 0 | 0 |
|  | 0 | 0.012 | 0 | 0 |
|  | 0 | 0.012 | 0 | 0 |
|  | 0 | 0.012 | 0 | 0 |
|  | 0 | 0.012 | 0 | 0 |
|  | 0 | 0.012 | 0 | 0 |
|  | 0 | 0.012 | 0 | 0 |
|  | 0 | 0.012 | 0 | 0 |
|  | 0 | 0.011 | 0 | 0 |
|  | 0 | 0.011 | 0 | 0 |
|  | 0 | 0.011 | 0 | 0 |
|  | 0 | 0.011 | 0 | 0 |
|  | 0 | 0.011 | 0 | 0 |
|  | 0 | 0.011 | 0 | 0 |
|  | 0 | 0.011 | 0 | 0 |
|  | 0 | 0.011 | 0 | 0 |
|  | 0 | 0.011 | 0 | 0 |
|  | 0 | 0.011 | 0 | 0 |
|  | 0 | 0.011 | 0 | 0 |
|  | 0 | 0.01 | 0 | 0 |
|  | 0 | 0.01 | 0 | 0 |
|  | 0 | 0.01 | 0 | 0 |
|  | 0 | 0.01 | 0 | 0 |
|  | 0 | 0.01 | 0 | 0 |
|  | 0 | 0.01 | 0 | 0 |
|  | 0 | 0.01 | 0 | 0 |
|  | 0 | 0.01 | 0 | 0 |
|  | 0 | 0.01 | 0 | 0 |
|  | 0 | 0.01 | 0 | 0 |
|  | 0 | 0.01 | 0 | 0 |
|  | 0 | 0.01 | 0 | 0 |
|  | 0 | 0.009 | 0 | 0 |
|  | 0 | 0.009 | 0 | 0 |
|  | 0 | 0.009 | 0 | 0 |
|  | 0 | 0.009 | 0 | 0 |
|  | 0 | 0.009 | 0 | 0 |
|  | 0 | 0.009 | 0 | 0 |
|  | 0 | 0.009 | 0 | 0 |
|  | 0 | 0.009 | 0 | 0 |
|  | 0 | 0.009 | 0 | 0 |
|  | 0 | 0.009 | 0 | 0 |
|  | 0 | 0.009 | 0 | 0 |
|  | 0 | 0.009 | 0 | 0 |
|  | 0 | 0.009 | 0 | 0 |
|  | 0 | 0.009 | 0 | 0 |
|  | 0 | 0.008 | 0 | 0 |
|  | 0 | 0.008 | 0 | 0 |
|  | 0 | 0.008 | 0 | 0 |
|  | 0 | 0.008 | 0 | 0 |
|  | 0 | 0.008 | 0 | 0 |
|  | 0 | 0.008 | 0 | 0 |
|  | 0 | 0.008 | 0 | 0 |
|  | 0 | 0.008 | 0 | 0 |
|  | 0 | 0.008 | 0 | 0 |
|  | 0 | 0.008 | 0 | 0 |
|  | 0 | 0.008 | 0 | 0 |
|  | 0 | 0.008 | 0 | 0 |
|  | 0 | 0.008 | 0 | 0 |
|  | 0 | 0.008 | 0 | 0 |
|  | 0 | 0.007 | 0 | 0 |
|  | 0 | 0.007 | 0 | 0 |
|  | 0 | 0.007 | 0 | 0 |
|  | 0 | 0.007 | 0 | 0 |
|  | 0 | 0.007 | 0 | 0 |
|  | 0 | 0.007 | 0 | 0 |
|  | 0 | 0.007 | 0 | 0 |
|  | 0 | 0.007 | 0 | 0 |
|  | 0 | 0.007 | 0 | 0 |
|  | 0 | 0.007 | 0 | 0 |
|  | 0 | 0.007 | 0 | 0 |
|  | 0 | 0.007 | 0 | 0 |
|  | 0 | 0.007 | 0 | 0 |
|  | 0 | 0.007 | 0 | 0 |
|  | 0 | 0.007 | 0 | 0 |
|  | 0 | 0.007 | 0 | 0 |
|  | 0 | 0.007 | 0 | 0 |
|  | 0 | 0.006 | 0 | 0 |
|  | 0 | 0.006 | 0 | 0 |
|  | 0 | 0.006 | 0 | 0 |
|  | 0 | 0.006 | 0 | 0 |
|  | 0 | 0.006 | 0 | 0 |
|  | 0 | 0.006 | 0 | 0 |
|  | 0 | 0.006 | 0 | 0 |
|  | 0 | 0.006 | 0 | 0 |
|  | 0 | 0.006 | 0 | 0 |
|  | 0 | 0.006 | 0 | 0 |
|  | 0 | 0.006 | 0 | 0 |
|  | 0 | 0.006 | 0 | 0 |
|  | 0 | 0.006 | 0 | 0 |
|  | 0 | 0.006 | 0 | 0 |
|  | 0 | 0.006 | 0 | 0 |
|  | 0 | 0.006 | 0 | 0 |
|  | 0 | 0.006 | 0 | 0 |
|  | 0 | 0.006 | 0 | 0 |
|  | 0 | 0.006 | 0 | 0 |
|  | 0 | 0.006 | 0 | 0 |